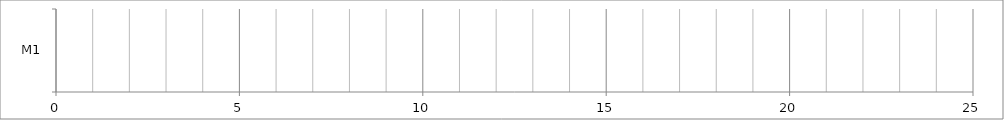
| Category | X | 0 |
|---|---|---|
| M1 | 0 | 0 |